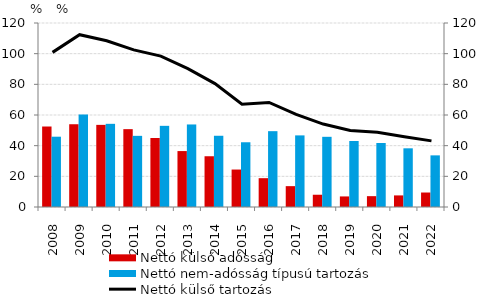
| Category | Nettó külső adósság | Nettó nem-adósság típusú tartozás |
|---|---|---|
| 2008.0 | 52.496 | 45.849 |
| 2009.0 | 53.975 | 60.318 |
| 2010.0 | 53.56 | 54.245 |
| 2011.0 | 50.774 | 46.406 |
| 2012.0 | 45.011 | 52.933 |
| 2013.0 | 36.475 | 53.831 |
| 2014.0 | 33.104 | 46.457 |
| 2015.0 | 24.432 | 42.223 |
| 2016.0 | 18.793 | 49.456 |
| 2017.0 | 13.599 | 46.702 |
| 2018.0 | 7.995 | 45.773 |
| 2019.0 | 6.893 | 43.046 |
| 2020.0 | 7.071 | 41.732 |
| 2021.0 | 7.559 | 38.275 |
| 2022.0 | 9.447 | 33.674 |